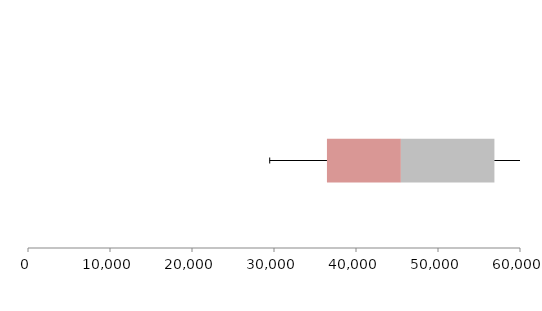
| Category | Series 1 | Series 2 | Series 3 |
|---|---|---|---|
| 0 | 36457.605 | 9015.685 | 11407.307 |